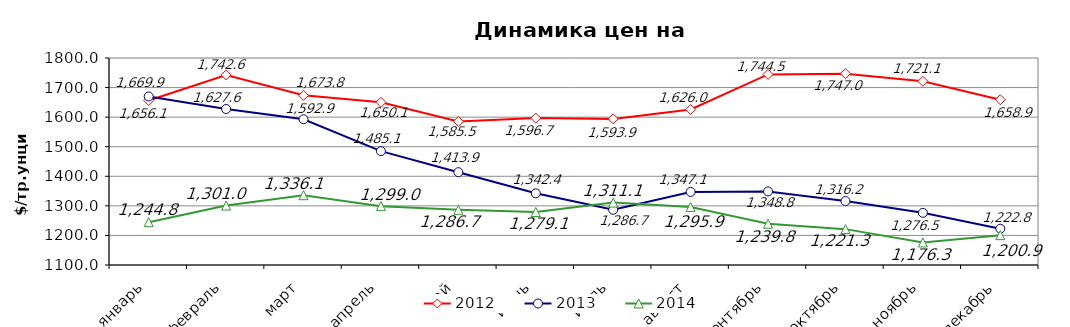
| Category | 2012 | 2013 | 2014 |
|---|---|---|---|
| январь | 1656.12 | 1669.91 | 1244.8 |
| февраль | 1742.62 | 1627.59 | 1300.98 |
| март | 1673.77 | 1592.86 | 1336.08 |
| апрель | 1650.07 | 1485.08 | 1299 |
| май | 1585.5 | 1413.87 | 1286.69 |
| июнь | 1596.7 | 1342.36 | 1279.1 |
| июль | 1593.9 | 1286.72 | 1311.11 |
| август | 1626 | 1347.1 | 1295.94 |
| сентябрь | 1744.5 | 1348.8 | 1239.75 |
| октябрь | 1747.01 | 1316.18 | 1221.27 |
| ноябрь | 1721.13 | 1276.45 | 1176.3 |
| декабрь | 1658.87 | 1222.76 | 1200.94 |